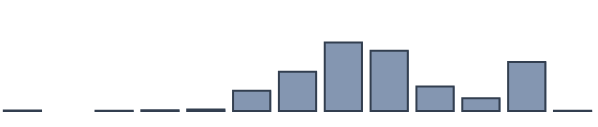
| Category | Series 0 |
|---|---|
| 0 | 0.15 |
| 1 | 0 |
| 2 | 0.103 |
| 3 | 0.307 |
| 4 | 0.552 |
| 5 | 7.302 |
| 6 | 14.106 |
| 7 | 24.678 |
| 8 | 21.679 |
| 9 | 8.838 |
| 10 | 4.59 |
| 11 | 17.644 |
| 12 | 0.052 |